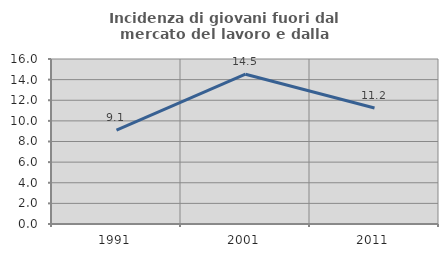
| Category | Incidenza di giovani fuori dal mercato del lavoro e dalla formazione  |
|---|---|
| 1991.0 | 9.101 |
| 2001.0 | 14.521 |
| 2011.0 | 11.247 |